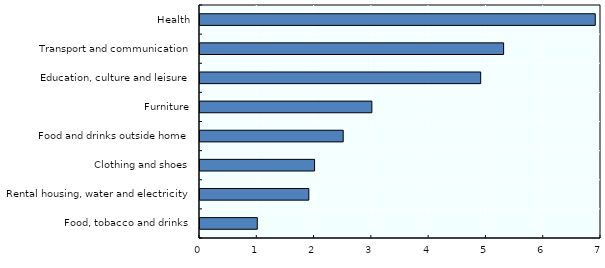
| Category | 20+/40- |
|---|---|
| Food, tobacco and drinks | 1 |
| Rental housing, water and electricity | 1.9 |
| Clothing and shoes | 2 |
| Food and drinks outside home | 2.5 |
| Furniture | 3 |
| Education, culture and leisure | 4.9 |
| Transport and communication | 5.3 |
| Health | 6.9 |